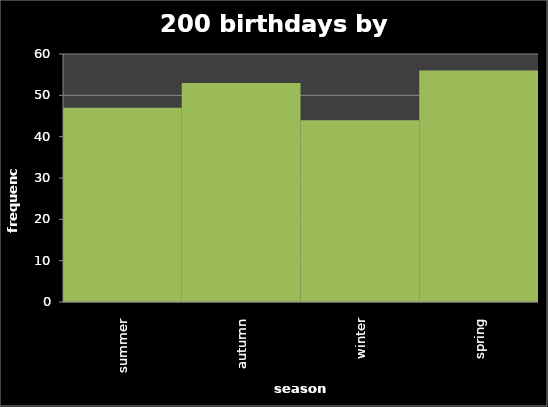
| Category | freq week |
|---|---|
| summer | 47 |
| autumn | 53 |
| winter | 44 |
| spring | 56 |